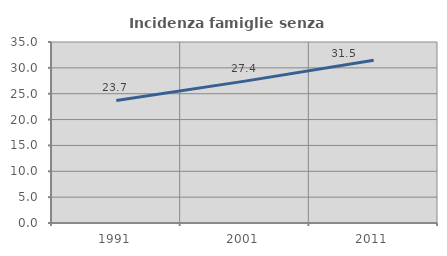
| Category | Incidenza famiglie senza nuclei |
|---|---|
| 1991.0 | 23.696 |
| 2001.0 | 27.432 |
| 2011.0 | 31.468 |